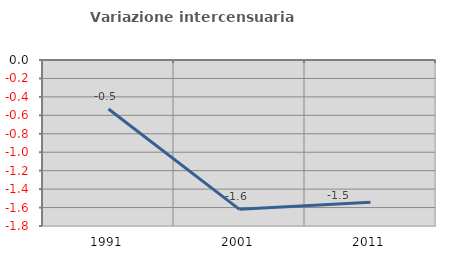
| Category | Variazione intercensuaria annua |
|---|---|
| 1991.0 | -0.532 |
| 2001.0 | -1.619 |
| 2011.0 | -1.542 |